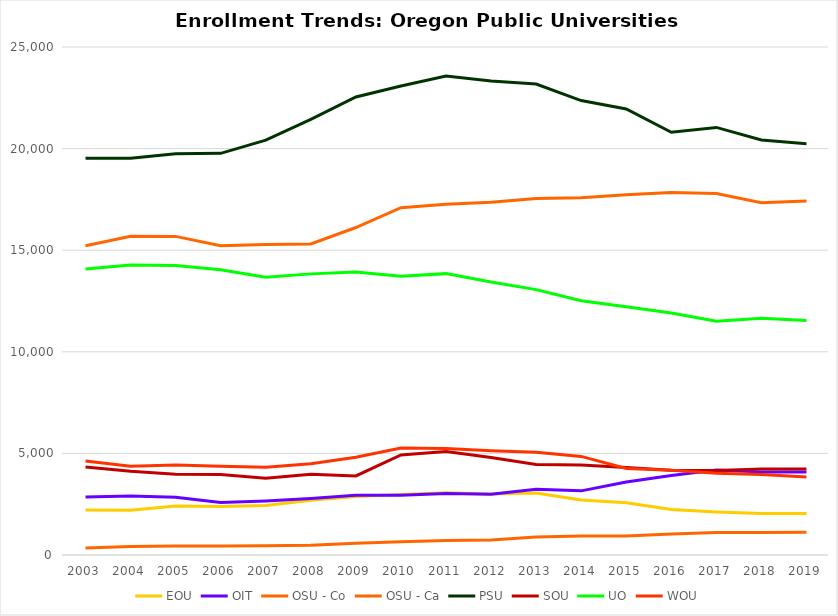
| Category | EOU | OIT | OSU - Co | OSU - Ca | PSU | SOU | UO | WOU |
|---|---|---|---|---|---|---|---|---|
| 2003.0 | 2209 | 2852 | 15215 | 342 | 19526 | 4331 | 14080 | 4629 |
| 2004.0 | 2202 | 2906 | 15682 | 418 | 19526 | 4120 | 14274 | 4369 |
| 2005.0 | 2415 | 2839 | 15680 | 444 | 19743 | 3971 | 14251 | 4428 |
| 2006.0 | 2384 | 2583 | 15224 | 446 | 19767 | 3959 | 14033 | 4370 |
| 2007.0 | 2440 | 2660 | 15282 | 457 | 20420 | 3774 | 13665 | 4317 |
| 2008.0 | 2697 | 2785 | 15307 | 483 | 21439 | 3970 | 13835 | 4496 |
| 2009.0 | 2883 | 2943 | 16116 | 580 | 22540 | 3890 | 13924 | 4810 |
| 2010.0 | 2977 | 2945 | 17092 | 649 | 23080 | 4924 | 13719 | 5268 |
| 2011.0 | 3066 | 3024 | 17263 | 713 | 23568 | 5091 | 13847 | 5246 |
| 2012.0 | 3005 | 2990 | 17363 | 741 | 23327 | 4803 | 13431 | 5127 |
| 2013.0 | 3052 | 3238 | 17544 | 886 | 23180 | 4459 | 13060 | 5056 |
| 2014.0 | 2702 | 3157 | 17576 | 934 | 22364 | 4424 | 12510 | 4853 |
| 2015.0 | 2570 | 3588 | 17727 | 939 | 21948 | 4305 | 12222 | 4259 |
| 2016.0 | 2237 | 3915 | 17841 | 1031 | 20802 | 4170 | 11914 | 4166 |
| 2017.0 | 2121 | 4187 | 17786 | 1106 | 21042 | 4158 | 11507 | 4028 |
| 2018.0 | 2047 | 4083 | 17340 | 1113 | 20420 | 4232 | 11654 | 3961 |
| 2019.0 | 2037 | 4079 | 17416 | 1117 | 20244 | 4237 | 11540 | 3839 |